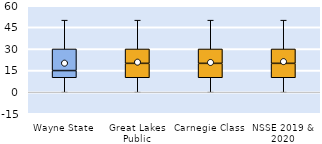
| Category | 25th | 50th | 75th |
|---|---|---|---|
| Wayne State | 10 | 5 | 15 |
| Great Lakes Public | 10 | 10 | 10 |
| Carnegie Class | 10 | 10 | 10 |
| NSSE 2019 & 2020 | 10 | 10 | 10 |